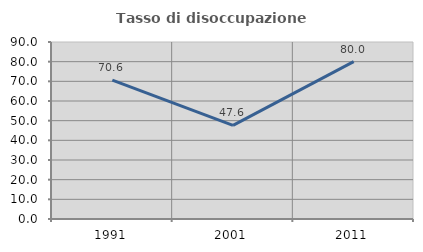
| Category | Tasso di disoccupazione giovanile  |
|---|---|
| 1991.0 | 70.635 |
| 2001.0 | 47.619 |
| 2011.0 | 80 |